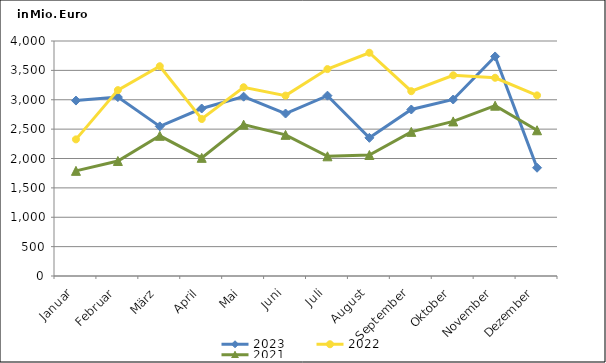
| Category | 2023 | 2022 | 2021 |
|---|---|---|---|
| Januar | 2985.967 | 2325.326 | 1789.858 |
| Februar | 3045.419 | 3163.601 | 1957.586 |
| März | 2546.679 | 3570.684 | 2386.173 |
| April | 2851.031 | 2672.127 | 2010.959 |
| Mai | 3052.289 | 3212.841 | 2575.949 |
| Juni | 2765.587 | 3070.605 | 2402.43 |
| Juli | 3069.419 | 3521.791 | 2037.458 |
| August | 2351.446 | 3799.82 | 2059.435 |
| September | 2833.806 | 3145.656 | 2453.415 |
| Oktober | 3004.142 | 3416.009 | 2631.274 |
| November | 3736.749 | 3374.097 | 2898.914 |
| Dezember | 1842.778 | 3073.978 | 2480.746 |